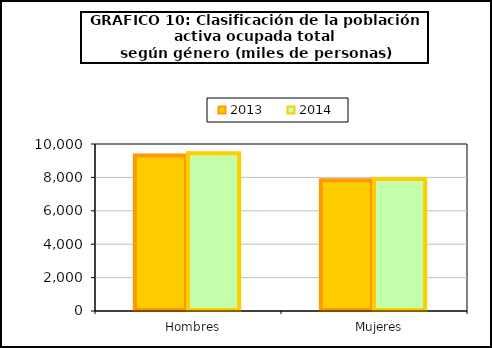
| Category | 2013 | 2014 |
|---|---|---|
|    Hombres | 9315.8 | 9442.7 |
|    Mujeres | 7823.2 | 7901.5 |